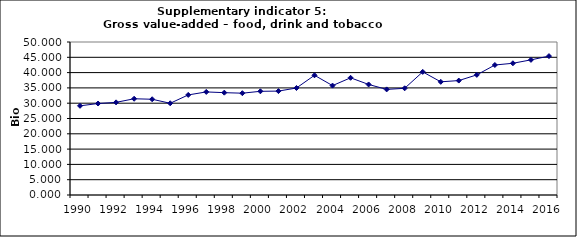
| Category | Gross value-added – food, drink and tobacco industry, Bio Euro (EC95) |
|---|---|
| 1990 | 29.145 |
| 1991 | 29.896 |
| 1992 | 30.277 |
| 1993 | 31.45 |
| 1994 | 31.289 |
| 1995 | 29.975 |
| 1996 | 32.705 |
| 1997 | 33.684 |
| 1998 | 33.443 |
| 1999 | 33.271 |
| 2000 | 33.888 |
| 2001 | 33.952 |
| 2002 | 34.968 |
| 2003 | 39.122 |
| 2004 | 35.75 |
| 2005 | 38.3 |
| 2006 | 36.124 |
| 2007 | 34.511 |
| 2008 | 34.866 |
| 2009 | 40.234 |
| 2010 | 36.987 |
| 2011 | 37.396 |
| 2012 | 39.26 |
| 2013 | 42.479 |
| 2014 | 43.048 |
| 2015 | 44.159 |
| 2016 | 45.39 |